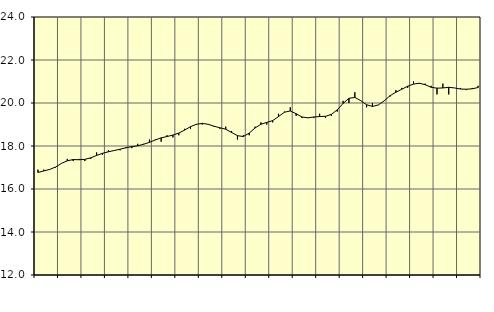
| Category | Piggar | Vård och omsorg, SNI 86-88 |
|---|---|---|
| nan | 16.9 | 16.77 |
| 1.0 | 16.9 | 16.84 |
| 1.0 | 16.9 | 16.91 |
| 1.0 | 17 | 17.02 |
| nan | 17.2 | 17.19 |
| 2.0 | 17.4 | 17.31 |
| 2.0 | 17.3 | 17.37 |
| 2.0 | 17.4 | 17.36 |
| nan | 17.3 | 17.38 |
| 3.0 | 17.4 | 17.45 |
| 3.0 | 17.7 | 17.56 |
| 3.0 | 17.6 | 17.66 |
| nan | 17.8 | 17.73 |
| 4.0 | 17.8 | 17.79 |
| 4.0 | 17.8 | 17.85 |
| 4.0 | 17.9 | 17.92 |
| nan | 17.9 | 17.97 |
| 5.0 | 18.1 | 18.01 |
| 5.0 | 18.1 | 18.08 |
| 5.0 | 18.3 | 18.17 |
| nan | 18.3 | 18.28 |
| 6.0 | 18.2 | 18.38 |
| 6.0 | 18.5 | 18.44 |
| 6.0 | 18.4 | 18.51 |
| nan | 18.5 | 18.6 |
| 7.0 | 18.8 | 18.74 |
| 7.0 | 18.8 | 18.9 |
| 7.0 | 19 | 19.01 |
| nan | 19 | 19.05 |
| 8.0 | 19 | 19.01 |
| 8.0 | 18.9 | 18.92 |
| 8.0 | 18.8 | 18.85 |
| nan | 18.9 | 18.78 |
| 9.0 | 18.7 | 18.63 |
| 9.0 | 18.3 | 18.48 |
| 9.0 | 18.5 | 18.44 |
| nan | 18.5 | 18.6 |
| 10.0 | 18.9 | 18.84 |
| 10.0 | 19.1 | 19.01 |
| 10.0 | 19 | 19.1 |
| nan | 19.1 | 19.18 |
| 11.0 | 19.5 | 19.37 |
| 11.0 | 19.6 | 19.57 |
| 11.0 | 19.8 | 19.63 |
| nan | 19.4 | 19.5 |
| 12.0 | 19.3 | 19.35 |
| 12.0 | 19.3 | 19.31 |
| 12.0 | 19.3 | 19.35 |
| nan | 19.5 | 19.37 |
| 13.0 | 19.3 | 19.38 |
| 13.0 | 19.4 | 19.47 |
| 13.0 | 19.6 | 19.68 |
| nan | 20.1 | 19.98 |
| 14.0 | 20 | 20.22 |
| 14.0 | 20.5 | 20.26 |
| 14.0 | 20.1 | 20.11 |
| nan | 19.8 | 19.92 |
| 15.0 | 20 | 19.84 |
| 15.0 | 19.9 | 19.91 |
| 15.0 | 20.1 | 20.1 |
| nan | 20.3 | 20.34 |
| 16.0 | 20.6 | 20.5 |
| 16.0 | 20.7 | 20.64 |
| 16.0 | 20.7 | 20.78 |
| nan | 21 | 20.88 |
| 17.0 | 20.9 | 20.92 |
| 17.0 | 20.9 | 20.85 |
| 17.0 | 20.8 | 20.73 |
| nan | 20.4 | 20.69 |
| 18.0 | 20.9 | 20.7 |
| 18.0 | 20.4 | 20.73 |
| 18.0 | 20.7 | 20.7 |
| nan | 20.7 | 20.65 |
| 19.0 | 20.6 | 20.64 |
| 19.0 | 20.7 | 20.66 |
| 19.0 | 20.8 | 20.72 |